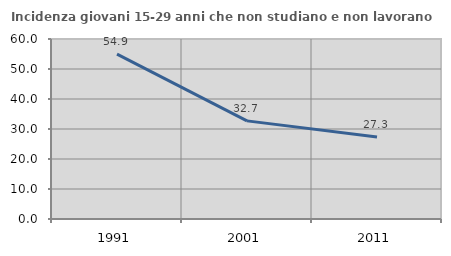
| Category | Incidenza giovani 15-29 anni che non studiano e non lavorano  |
|---|---|
| 1991.0 | 54.942 |
| 2001.0 | 32.71 |
| 2011.0 | 27.297 |